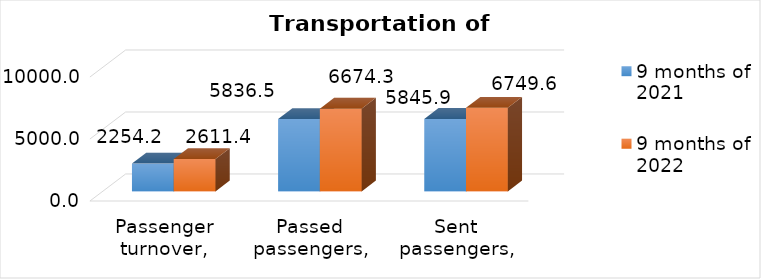
| Category | 9 months of 2021 | 9 months of 2022 |
|---|---|---|
| Passenger turnover, mln.pas.km | 2254.2 | 2611.4 |
| Passed passengers, mln. pas. | 5836.5 | 6674.3 |
| Sent passengers, mln. pas. | 5845.9 | 6749.6 |